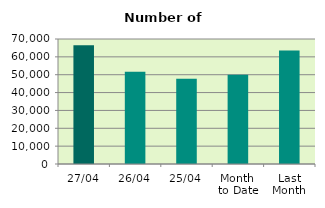
| Category | Series 0 |
|---|---|
| 27/04 | 66472 |
| 26/04 | 51678 |
| 25/04 | 47708 |
| Month 
to Date | 49983.529 |
| Last
Month | 63497.391 |